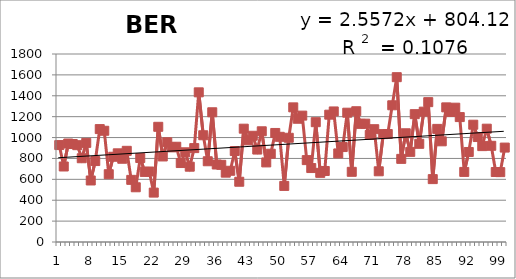
| Category | 1913-2012 |
|---|---|
| 0 | 928 |
| 1 | 723 |
| 2 | 943 |
| 3 | 938 |
| 4 | 927 |
| 5 | 802 |
| 6 | 949 |
| 7 | 589 |
| 8 | 775 |
| 9 | 1081 |
| 10 | 1065 |
| 11 | 649 |
| 12 | 816 |
| 13 | 849 |
| 14 | 797 |
| 15 | 873 |
| 16 | 595 |
| 17 | 524 |
| 18 | 804 |
| 19 | 671 |
| 20 | 675 |
| 21 | 473 |
| 22 | 1103 |
| 23 | 819 |
| 24 | 955 |
| 25 | 906 |
| 26 | 912 |
| 27 | 756 |
| 28 | 859 |
| 29 | 721 |
| 30 | 899 |
| 31 | 1433 |
| 32 | 1022 |
| 33 | 773 |
| 34 | 1242 |
| 35 | 742 |
| 36 | 739 |
| 37 | 664 |
| 38 | 682 |
| 39 | 871 |
| 40 | 577 |
| 41 | 1085 |
| 42 | 973 |
| 43 | 1017 |
| 44 | 885 |
| 45 | 1060 |
| 46 | 762 |
| 47 | 845 |
| 48 | 1044 |
| 49 | 1007 |
| 50 | 537 |
| 51 | 998 |
| 52 | 1289 |
| 53 | 1180 |
| 54 | 1210 |
| 55 | 784 |
| 56 | 708 |
| 57 | 1147 |
| 58 | 662 |
| 59 | 680 |
| 60 | 1219 |
| 61 | 1250 |
| 62 | 848 |
| 63 | 909 |
| 64 | 1238 |
| 65 | 672 |
| 66 | 1252 |
| 67 | 1131 |
| 68 | 1133 |
| 69 | 1025 |
| 70 | 1080 |
| 71 | 677 |
| 72 | 1033 |
| 73 | 1034 |
| 74 | 1309 |
| 75 | 1578 |
| 76 | 796 |
| 77 | 1041 |
| 78 | 863 |
| 79 | 1224 |
| 80 | 940 |
| 81 | 1248 |
| 82 | 1339 |
| 83 | 602 |
| 84 | 1083 |
| 85 | 964 |
| 86 | 1289 |
| 87 | 1245 |
| 88 | 1286 |
| 89 | 1196 |
| 90 | 671 |
| 91 | 862 |
| 92 | 1123 |
| 93 | 1005 |
| 94 | 918 |
| 95 | 1085 |
| 96 | 921 |
| 97 | 670 |
| 98 | 669 |
| 99 | 904 |